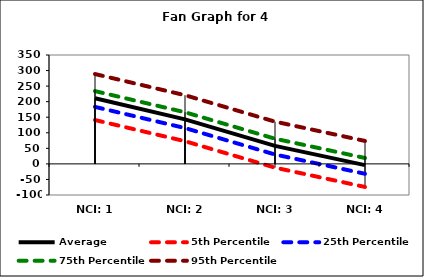
| Category | Average | 5th Percentile | 25th Percentile | 75th Percentile | 95th Percentile |
|---|---|---|---|---|---|
| NCI: 1 | 210.926 | 140.927 | 183.198 | 233.956 | 288.785 |
| NCI: 2 | 142.926 | 72.927 | 115.198 | 165.956 | 220.785 |
| NCI: 3 | 57.926 | -12.073 | 30.198 | 80.956 | 135.785 |
| NCI: 4 | -4.074 | -74.073 | -31.802 | 18.956 | 73.785 |